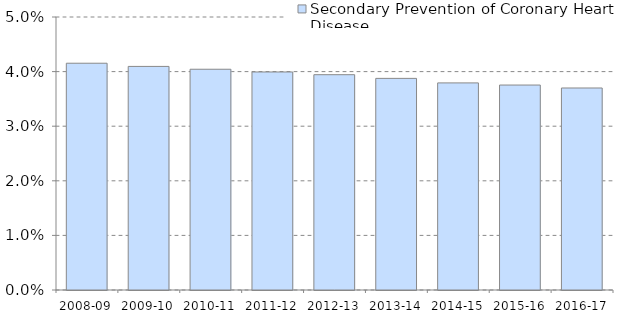
| Category | Secondary Prevention of Coronary Heart Disease  |
|---|---|
| 2008-09 | 0.042 |
| 2009-10 | 0.041 |
| 2010-11 | 0.04 |
| 2011-12 | 0.04 |
| 2012-13 | 0.039 |
| 2013-14 | 0.039 |
| 2014-15 | 0.038 |
| 2015-16 | 0.038 |
| 2016-17 | 0.037 |